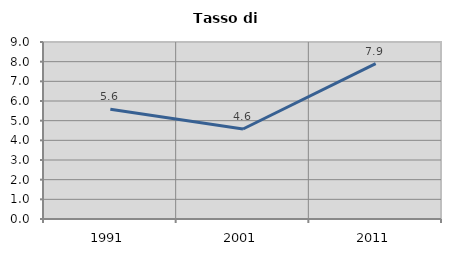
| Category | Tasso di disoccupazione   |
|---|---|
| 1991.0 | 5.58 |
| 2001.0 | 4.575 |
| 2011.0 | 7.905 |